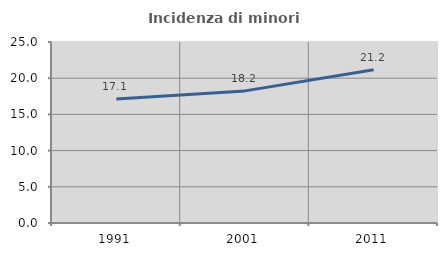
| Category | Incidenza di minori stranieri |
|---|---|
| 1991.0 | 17.143 |
| 2001.0 | 18.248 |
| 2011.0 | 21.159 |